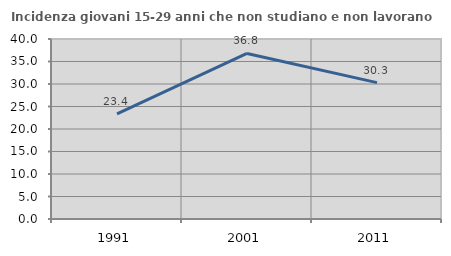
| Category | Incidenza giovani 15-29 anni che non studiano e non lavorano  |
|---|---|
| 1991.0 | 23.357 |
| 2001.0 | 36.783 |
| 2011.0 | 30.303 |